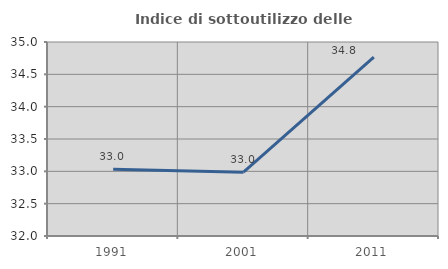
| Category | Indice di sottoutilizzo delle abitazioni  |
|---|---|
| 1991.0 | 33.033 |
| 2001.0 | 32.987 |
| 2011.0 | 34.765 |